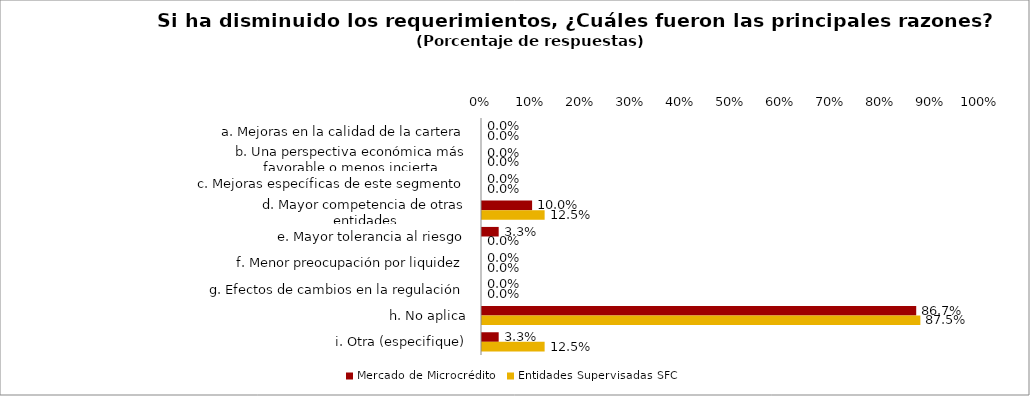
| Category | Mercado de Microcrédito | Entidades Supervisadas SFC |
|---|---|---|
| a. Mejoras en la calidad de la cartera | 0 | 0 |
| b. Una perspectiva económica más favorable o menos incierta | 0 | 0 |
| c. Mejoras específicas de este segmento | 0 | 0 |
| d. Mayor competencia de otras entidades | 0.1 | 0.125 |
| e. Mayor tolerancia al riesgo | 0.033 | 0 |
| f. Menor preocupación por liquidez | 0 | 0 |
| g. Efectos de cambios en la regulación | 0 | 0 |
| h. No aplica | 0.867 | 0.875 |
| i. Otra (especifique) | 0.033 | 0.125 |